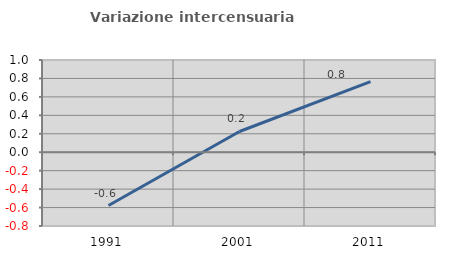
| Category | Variazione intercensuaria annua |
|---|---|
| 1991.0 | -0.578 |
| 2001.0 | 0.225 |
| 2011.0 | 0.765 |